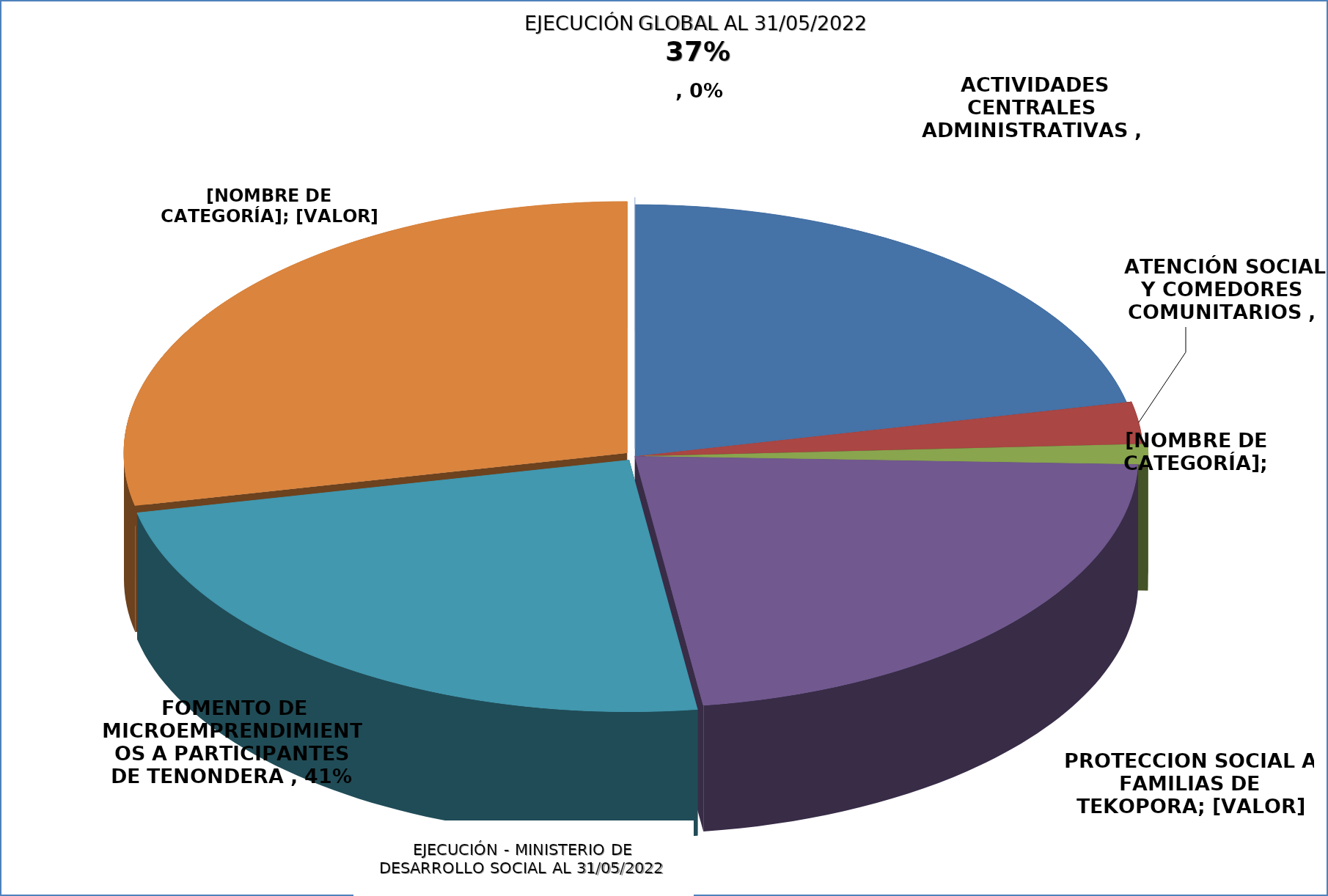
| Category | EJECUCIÓN - MINISTERIO DE DESARROLLO SOCIAL |
|---|---|
| ACTIVIDADES CENTRALES ADMINISTRATIVAS | 0.369 |
| ATENCIÓN SOCIAL Y COMEDORES COMUNITARIOS | 0.046 |
| ASISTENCIA A PESCADORES POR VEDA PESQUERA | 0.022 |
| PROTECCIÓN SOCIAL A FAMILIAS DE TEKOPORA  | 0.382 |
| FOMENTO DE MICROEMPRENDIMIENTOS A PARTICIPANTES DE TENONDERA | 0.407 |
| REGULARIZACIÓN DE TERRITORIOS SOCIALES, TEKOHA | 0.485 |